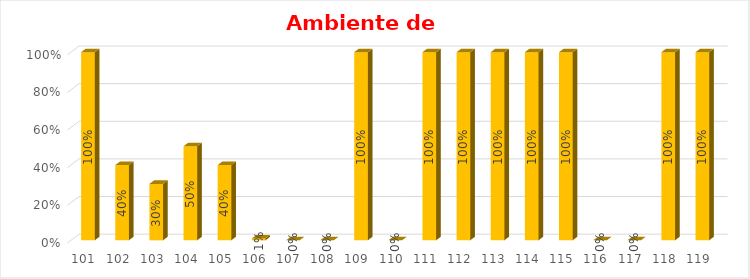
| Category | % Avance |
|---|---|
| 101.0 | 1 |
| 102.0 | 0.4 |
| 103.0 | 0.3 |
| 104.0 | 0.5 |
| 105.0 | 0.4 |
| 106.0 | 0.01 |
| 107.0 | 0 |
| 108.0 | 0 |
| 109.0 | 1 |
| 110.0 | 0 |
| 111.0 | 1 |
| 112.0 | 1 |
| 113.0 | 1 |
| 114.0 | 1 |
| 115.0 | 1 |
| 116.0 | 0 |
| 117.0 | 0 |
| 118.0 | 1 |
| 119.0 | 1 |